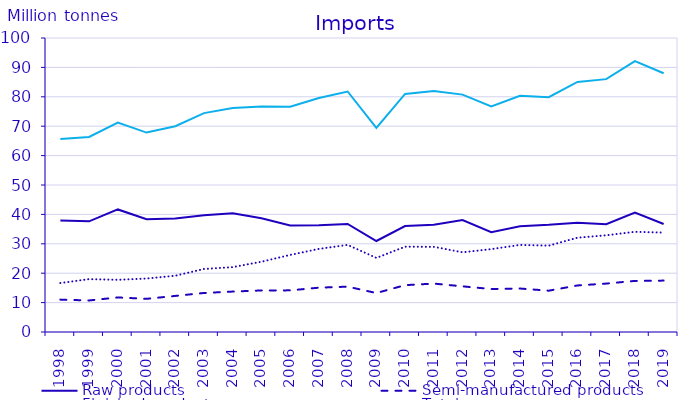
| Category | Raw products | Semi-manufactured products | Finished products | Total |
|---|---|---|---|---|
| 1998.0 | 37.966 | 11.014 | 16.661 | 65.641 |
| 1999.0 | 37.636 | 10.727 | 17.985 | 66.347 |
| 2000.0 | 41.688 | 11.758 | 17.752 | 71.198 |
| 2001.0 | 38.371 | 11.277 | 18.182 | 67.83 |
| 2002.0 | 38.577 | 12.277 | 19.143 | 69.998 |
| 2003.0 | 39.734 | 13.273 | 21.444 | 74.451 |
| 2004.0 | 40.405 | 13.753 | 22.066 | 76.225 |
| 2005.0 | 38.684 | 14.132 | 23.906 | 76.722 |
| 2006.0 | 36.256 | 14.162 | 26.212 | 76.629 |
| 2007.0 | 36.27 | 15.078 | 28.265 | 79.613 |
| 2008.0 | 36.749 | 15.423 | 29.631 | 81.803 |
| 2009.0 | 30.949 | 13.254 | 25.211 | 69.414 |
| 2010.0 | 36.017 | 15.931 | 29.011 | 80.96 |
| 2011.0 | 36.516 | 16.464 | 28.968 | 81.948 |
| 2012.0 | 38.104 | 15.532 | 27.102 | 80.737 |
| 2013.0 | 33.918 | 14.615 | 28.185 | 76.719 |
| 2014.0 | 35.964 | 14.786 | 29.615 | 80.364 |
| 2015.0 | 36.447 | 14.052 | 29.373 | 79.871 |
| 2016.0 | 37.172 | 15.832 | 32.07 | 85.074 |
| 2017.0 | 36.644 | 16.467 | 32.893 | 86.004 |
| 2018.0 | 40.659 | 17.381 | 34.081 | 92.121 |
| 2019.0 | 36.723 | 17.482 | 33.799 | 88.003 |